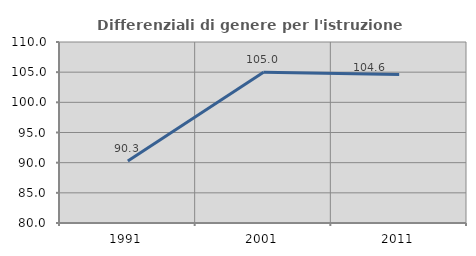
| Category | Differenziali di genere per l'istruzione superiore |
|---|---|
| 1991.0 | 90.279 |
| 2001.0 | 104.97 |
| 2011.0 | 104.602 |